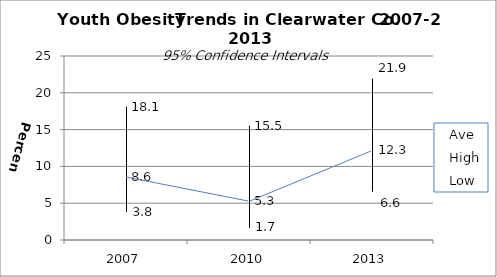
| Category | Ave | High | Low |
|---|---|---|---|
| 2007.0 | 8.6 | 18.1 | 3.8 |
| 2010.0 | 5.3 | 15.5 | 1.7 |
| 2013.0 | 12.3 | 21.9 | 6.6 |